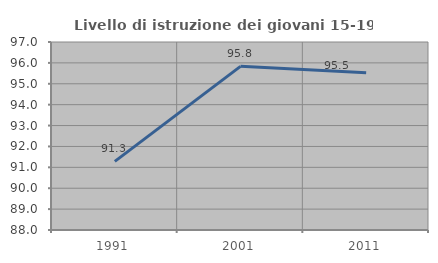
| Category | Livello di istruzione dei giovani 15-19 anni |
|---|---|
| 1991.0 | 91.288 |
| 2001.0 | 95.835 |
| 2011.0 | 95.522 |